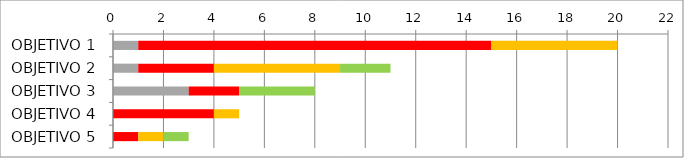
| Category | Series 1 | Series 2 | Series 3 | Series 4 | Series 5 |
|---|---|---|---|---|---|
| OBJETIVO 1 | 1 | 14 | 5 | 0 | 0 |
| OBJETIVO 2 | 1 | 3 | 5 | 2 | 0 |
| OBJETIVO 3 | 3 | 2 | 0 | 3 | 0 |
| OBJETIVO 4 | 0 | 4 | 1 | 0 | 0 |
| OBJETIVO 5 | 0 | 1 | 1 | 1 | 0 |